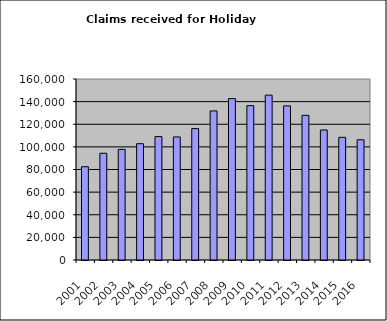
| Category | Series 0 |
|---|---|
| 2001.0 | 82454 |
| 2002.0 | 94358 |
| 2003.0 | 97793 |
| 2004.0 | 102813 |
| 2005.0 | 109089 |
| 2006.0 | 108785 |
| 2007.0 | 116159 |
| 2008.0 | 131779 |
| 2009.0 | 142663 |
| 2010.0 | 136417 |
| 2011.0 | 145734 |
| 2012.0 | 136250 |
| 2013.0 | 127876 |
| 2014.0 | 114913 |
| 2015.0 | 108465 |
| 2016.0 | 106273 |